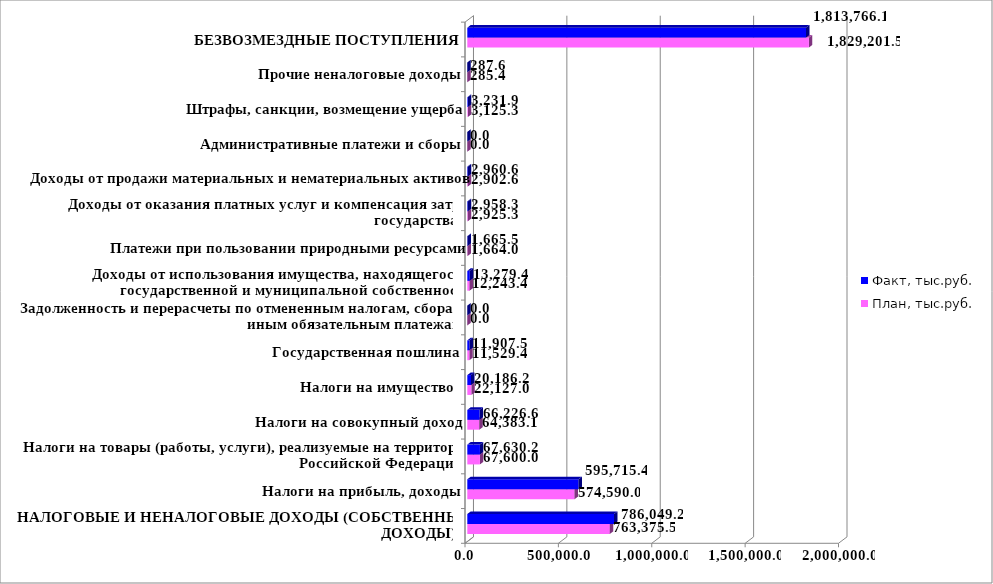
| Category | План, тыс.руб. | Факт, тыс.руб. |
|---|---|---|
| НАЛОГОВЫЕ И НЕНАЛОГОВЫЕ ДОХОДЫ (СОБСТВЕННЫЕ ДОХОДЫ) | 763375.5 | 786049.2 |
| Налоги на прибыль, доходы | 574590 | 595715.4 |
| Налоги на товары (работы, услуги), реализуемые на территории Российской Федерации | 67600 | 67630.2 |
| Налоги на совокупный доход | 64383.1 | 66226.6 |
| Налоги на имущество  | 22127 | 20186.2 |
| Государственная пошлина | 11529.4 | 11907.5 |
| Задолженность и перерасчеты по отмененным налогам, сборам и иным обязательным платежам | 0 | 0 |
| Доходы от использования имущества, находящегося в государственной и муниципальной собственности | 12243.4 | 13279.4 |
| Платежи при пользовании природными ресурсами | 1664 | 1665.5 |
| Доходы от оказания платных услуг и компенсация затрат государства | 2925.3 | 2958.3 |
| Доходы от продажи материальных и нематериальных активов | 2902.6 | 2960.6 |
| Административные платежи и сборы | 0 | 0 |
| Штрафы, санкции, возмещение ущерба | 3125.3 | 3231.9 |
| Прочие неналоговые доходы | 285.4 | 287.6 |
| БЕЗВОЗМЕЗДНЫЕ ПОСТУПЛЕНИЯ | 1829201.5 | 1813766.1 |